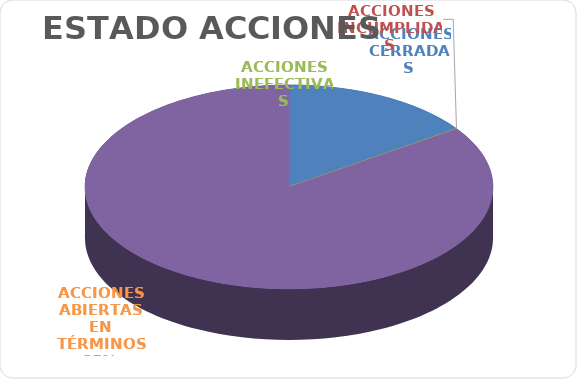
| Category | Series 0 |
|---|---|
| ACCIONES CERRADAS | 21 |
| ACCIONES INCUMPLIDAS | 0 |
| ACCIONES INEFECTIVAS | 0 |
| ACCIONES ABIERTAS EN TÉRMINOS | 116 |